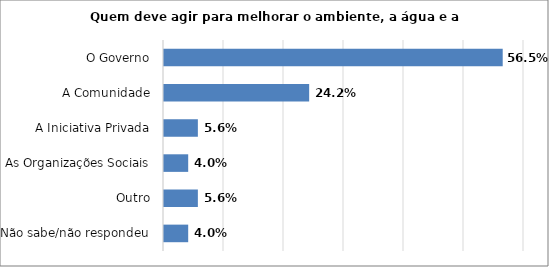
| Category | Series 0 |
|---|---|
| Não sabe/não respondeu | 0.04 |
| Outro | 0.056 |
| As Organizações Sociais | 0.04 |
| A Iniciativa Privada | 0.056 |
| A Comunidade | 0.242 |
| O Governo | 0.565 |